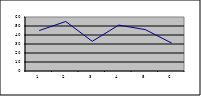
| Category | Series 0 |
|---|---|
| 0 | 45 |
| 1 | 55 |
| 2 | 33 |
| 3 | 51 |
| 4 | 46 |
| 5 | 31 |